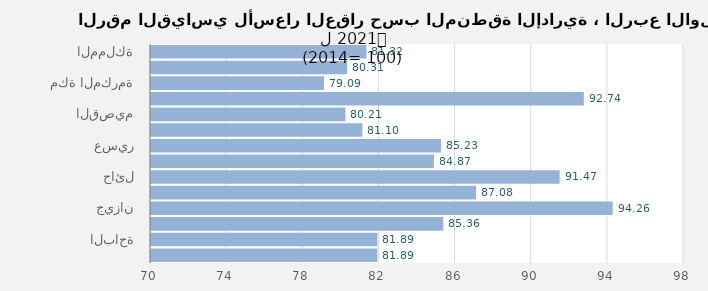
| Category | 2021 |
|---|---|
| المملكة | 81.315 |
| الرياض | 80.306 |
| مكة المكرمة | 79.091 |
| المدينة المنورة | 92.738 |
| القصيم | 80.214 |
| المنطقة الشرقية | 81.104 |
| عسير | 85.234 |
| تبوك | 84.865 |
| حائل | 91.465 |
| المنطقة الشمالية | 87.079 |
| جيزان | 94.256 |
| نجران | 85.355 |
| الباحة | 81.89 |
| الجوف | 81.888 |